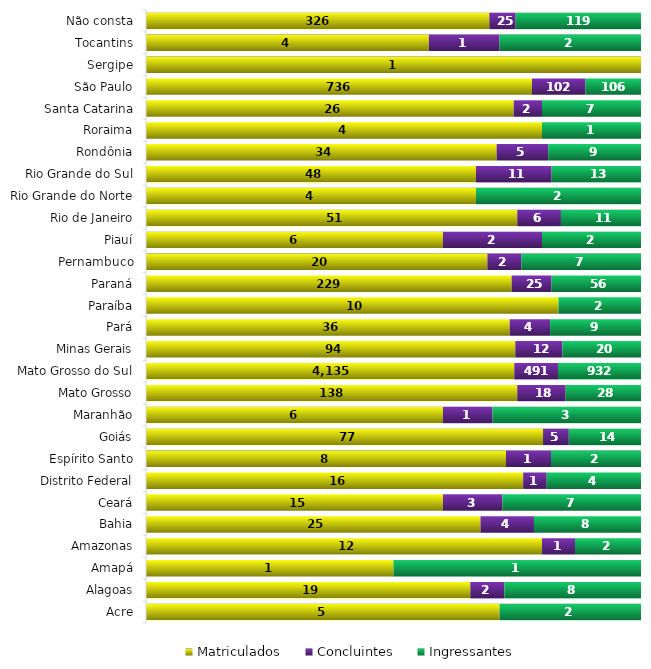
| Category | Matriculados | Concluintes | Ingressantes |
|---|---|---|---|
| 0 | 5 | 0 | 2 |
| 1 | 19 | 2 | 8 |
| 2 | 1 | 0 | 1 |
| 3 | 12 | 1 | 2 |
| 4 | 25 | 4 | 8 |
| 5 | 15 | 3 | 7 |
| 6 | 16 | 1 | 4 |
| 7 | 8 | 1 | 2 |
| 8 | 77 | 5 | 14 |
| 9 | 6 | 1 | 3 |
| 10 | 138 | 18 | 28 |
| 11 | 4135 | 491 | 932 |
| 12 | 94 | 12 | 20 |
| 13 | 36 | 4 | 9 |
| 14 | 10 | 0 | 2 |
| 15 | 229 | 25 | 56 |
| 16 | 20 | 2 | 7 |
| 17 | 6 | 2 | 2 |
| 18 | 51 | 6 | 11 |
| 19 | 4 | 0 | 2 |
| 20 | 48 | 11 | 13 |
| 21 | 34 | 5 | 9 |
| 22 | 4 | 0 | 1 |
| 23 | 26 | 2 | 7 |
| 24 | 736 | 102 | 106 |
| 25 | 1 | 0 | 0 |
| 26 | 4 | 1 | 2 |
| 27 | 326 | 25 | 119 |